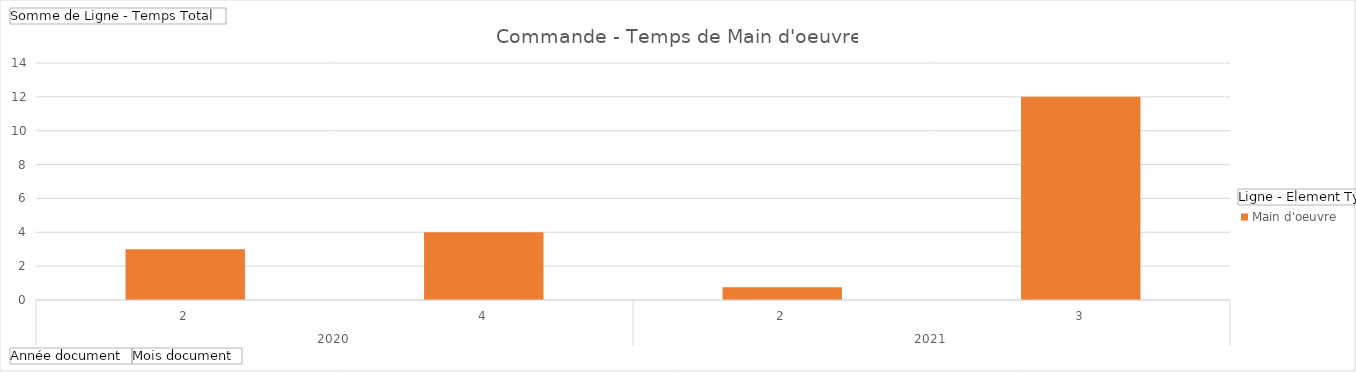
| Category | Main d'oeuvre |
|---|---|
| 0 | 3 |
| 1 | 4 |
| 2 | 0.75 |
| 3 | 12 |